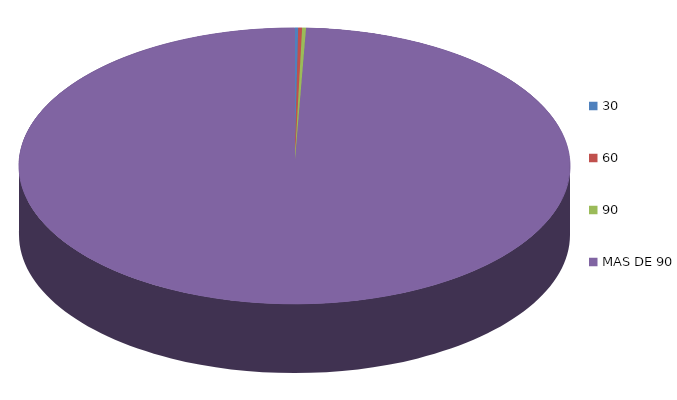
| Category | Series 0 | 88,103.9 |
|---|---|---|
| 0 | 88103.9 |  |
| 1 | 91554.6 |  |
| 2 | 95013 |  |
| 3 | 40669140.9 |  |